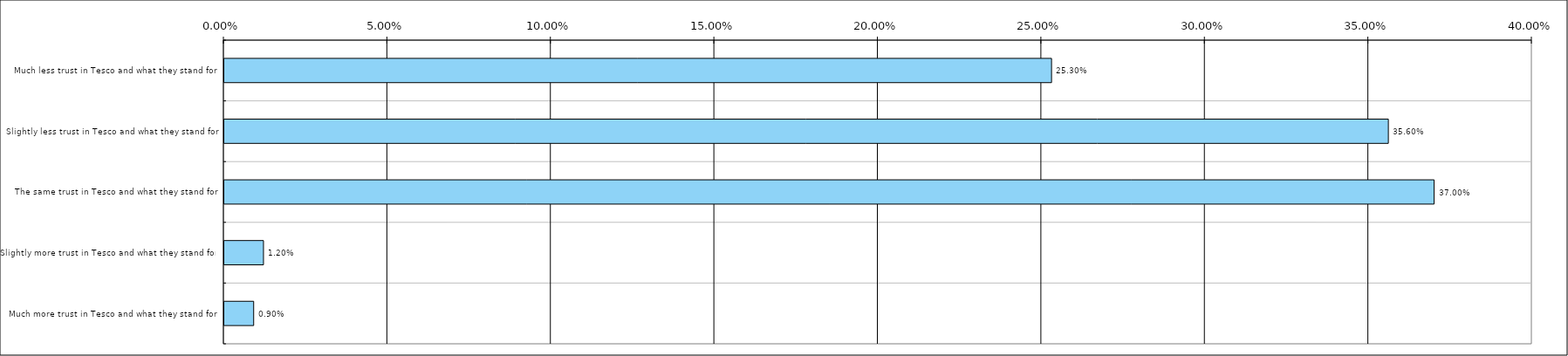
| Category | Total(United Kingdom) |
|---|---|
| Much less trust in Tesco and what they stand for | 0.253 |
| Slightly less trust in Tesco and what they stand for | 0.356 |
| The same trust in Tesco and what they stand for | 0.37 |
| Slightly more trust in Tesco and what they stand for | 0.012 |
| Much more trust in Tesco and what they stand for | 0.009 |